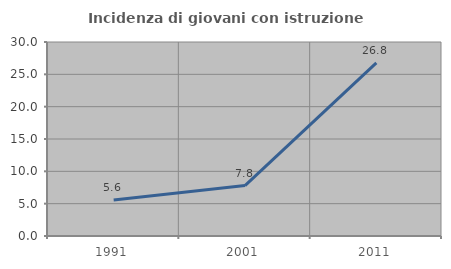
| Category | Incidenza di giovani con istruzione universitaria |
|---|---|
| 1991.0 | 5.556 |
| 2001.0 | 7.792 |
| 2011.0 | 26.768 |